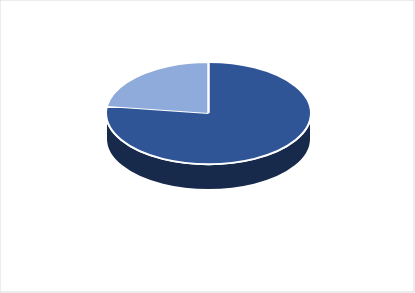
| Category | Series 0 |
|---|---|
| PRESUPUESTO VIGENTE PARA 2023 | 26648782 |
| PRESUPUESTO EJECUTADO  | 7869653.21 |
| PORCENTAJE DE EJECUCIÓN  | 0.295 |